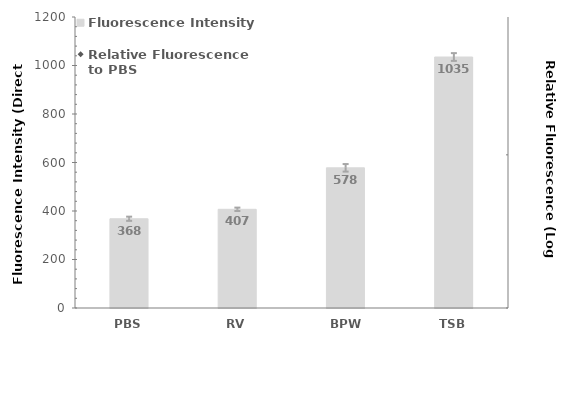
| Category | Fluorescence Intensity |
|---|---|
| PBS | 368 |
| RV | 407 |
| BPW | 578 |
| TSB | 1035 |